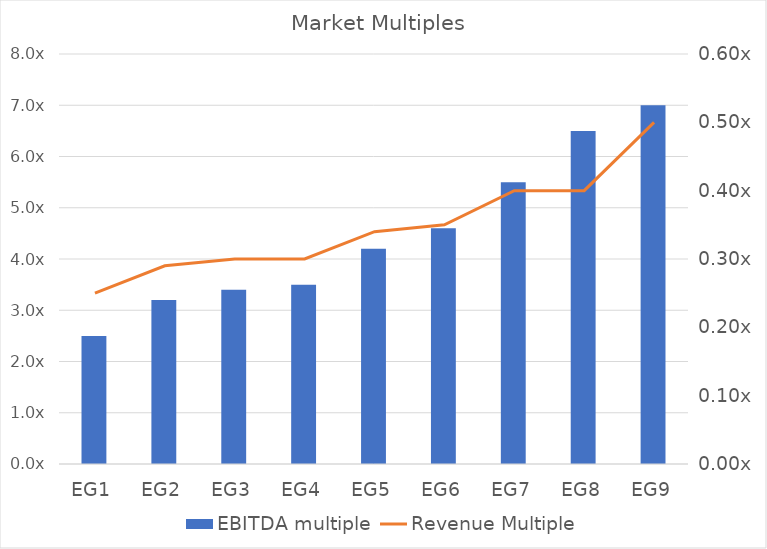
| Category | EBITDA multiple |
|---|---|
| EG1 | 2.5 |
| EG2 | 3.2 |
| EG3 | 3.4 |
| EG4 | 3.5 |
| EG5 | 4.2 |
| EG6 | 4.6 |
| EG7 | 5.5 |
| EG8 | 6.5 |
| EG9 | 7 |